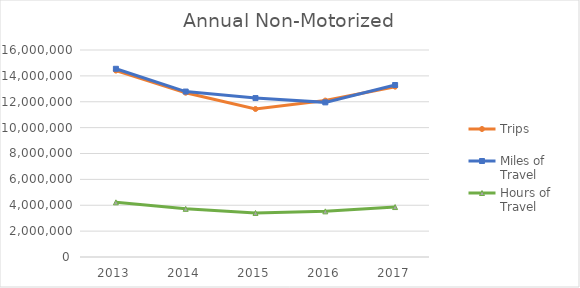
| Category | Trips | Miles of Travel | Hours of Travel |
|---|---|---|---|
| 2013 | 14410040.228 | 14547743.234 | 4225089.007 |
| 2014 | 12698999.83 | 12788025.178 | 3721140.699 |
| 2015 | 11440412.194 | 12282808.386 | 3405710.085 |
| 2016 | 12089448.59 | 11952305.416 | 3526989.111 |
| 2017 | 13166189.839 | 13294364.7 | 3860551.561 |